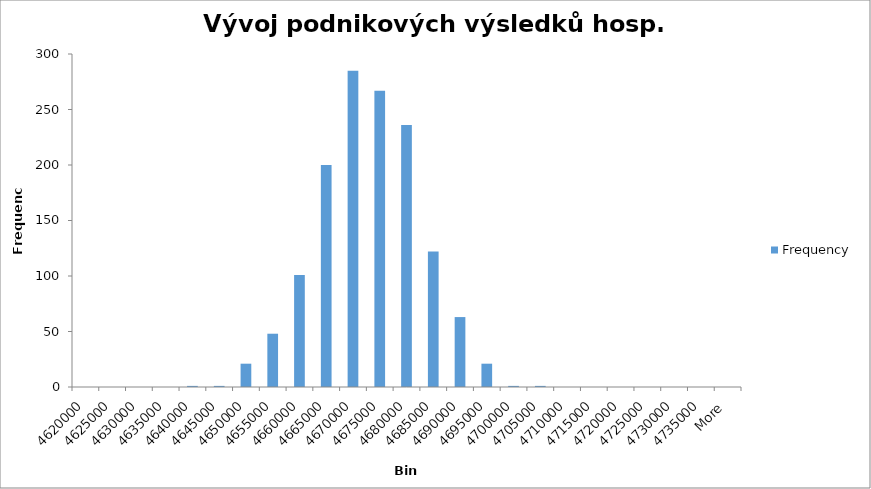
| Category | Frequency |
|---|---|
| 4620000 | 0 |
| 4625000 | 0 |
| 4630000 | 0 |
| 4635000 | 0 |
| 4640000 | 1 |
| 4645000 | 1 |
| 4650000 | 21 |
| 4655000 | 48 |
| 4660000 | 101 |
| 4665000 | 200 |
| 4670000 | 285 |
| 4675000 | 267 |
| 4680000 | 236 |
| 4685000 | 122 |
| 4690000 | 63 |
| 4695000 | 21 |
| 4700000 | 1 |
| 4705000 | 1 |
| 4710000 | 0 |
| 4715000 | 0 |
| 4720000 | 0 |
| 4725000 | 0 |
| 4730000 | 0 |
| 4735000 | 0 |
| More | 0 |